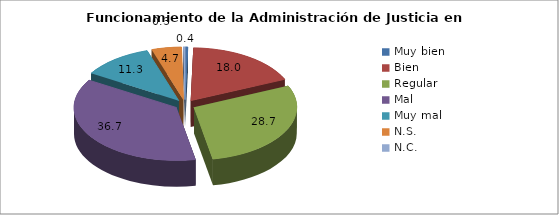
| Category | % |
|---|---|
| Muy bien  | 0.4 |
| Bien | 18 |
| Regular | 28.7 |
| Mal  | 36.7 |
| Muy mal | 11.3 |
| N.S.  | 4.7 |
| N.C.  | 0.3 |